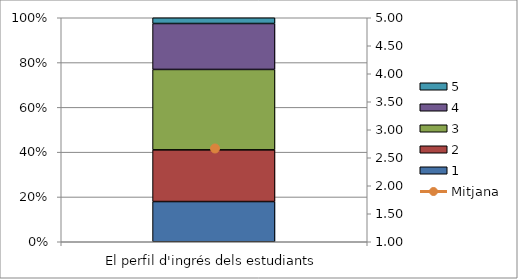
| Category | 1 | 2 | 3 | 4 | 5 |
|---|---|---|---|---|---|
| El perfil d'ingrés dels estudiants | 7 | 9 | 14 | 8 | 1 |